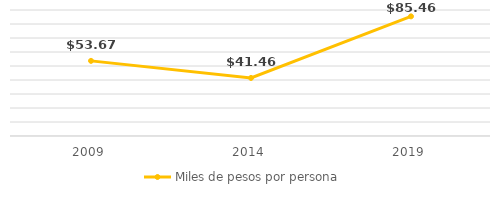
| Category | Miles de pesos por persona |
|---|---|
| 2009.0 | 53.666 |
| 2014.0 | 41.458 |
| 2019.0 | 85.462 |